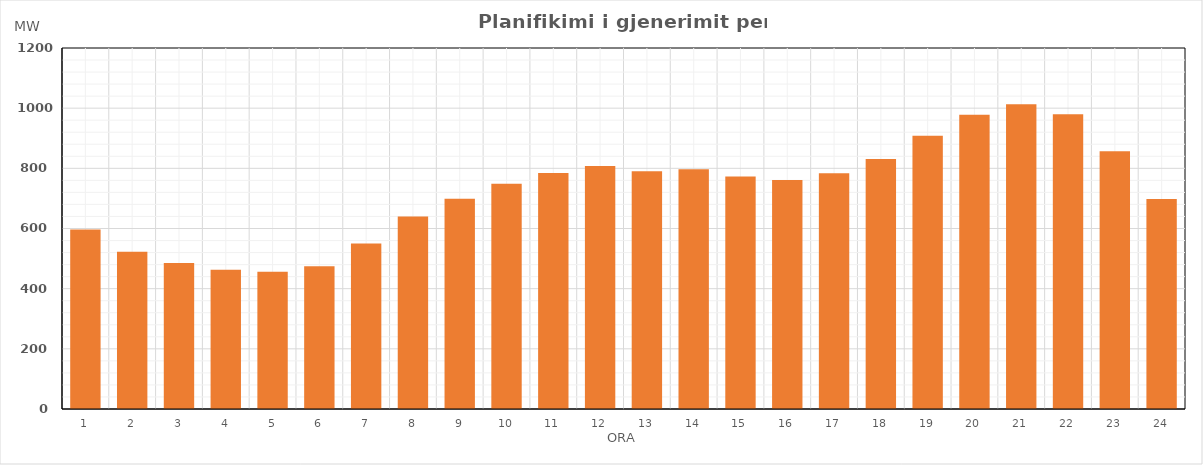
| Category | Max (MW) |
|---|---|
| 0 | 596.56 |
| 1 | 522.97 |
| 2 | 485.72 |
| 3 | 462.48 |
| 4 | 456.26 |
| 5 | 474.23 |
| 6 | 550.02 |
| 7 | 639.71 |
| 8 | 699.11 |
| 9 | 748.75 |
| 10 | 784.16 |
| 11 | 807.96 |
| 12 | 790.65 |
| 13 | 796.65 |
| 14 | 772.46 |
| 15 | 761.05 |
| 16 | 783.86 |
| 17 | 830.64 |
| 18 | 908.57 |
| 19 | 978.17 |
| 20 | 1013.02 |
| 21 | 979.89 |
| 22 | 856.4 |
| 23 | 697.73 |